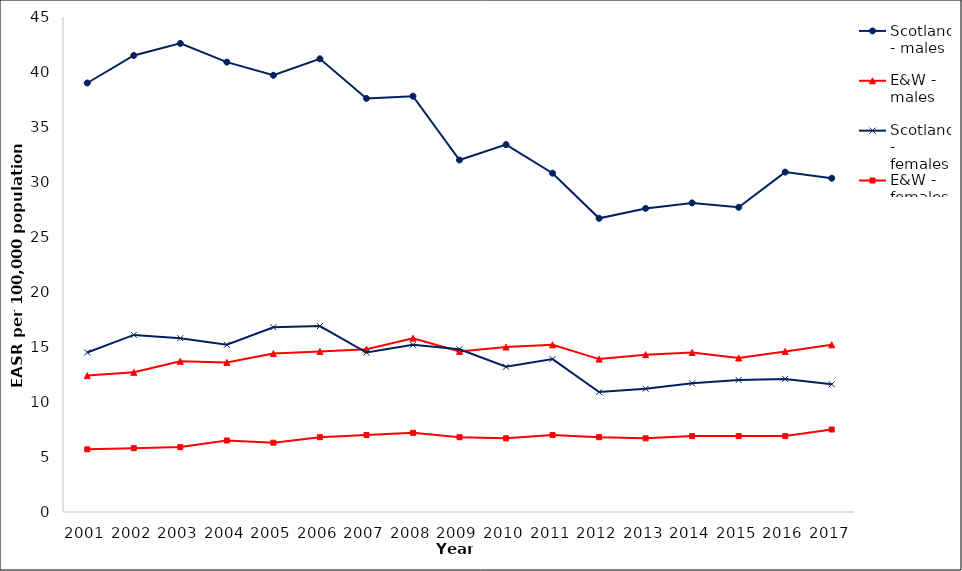
| Category | Scotland - males | E&W - males | Scotland - females | E&W - females |
|---|---|---|---|---|
| 2001.0 | 39 | 12.4 | 14.5 | 5.7 |
| 2002.0 | 41.5 | 12.7 | 16.1 | 5.8 |
| 2003.0 | 42.6 | 13.7 | 15.8 | 5.9 |
| 2004.0 | 40.9 | 13.6 | 15.2 | 6.5 |
| 2005.0 | 39.7 | 14.4 | 16.8 | 6.3 |
| 2006.0 | 41.2 | 14.6 | 16.9 | 6.8 |
| 2007.0 | 37.6 | 14.8 | 14.5 | 7 |
| 2008.0 | 37.8 | 15.8 | 15.2 | 7.2 |
| 2009.0 | 32 | 14.6 | 14.8 | 6.8 |
| 2010.0 | 33.4 | 15 | 13.2 | 6.7 |
| 2011.0 | 30.8 | 15.2 | 13.9 | 7 |
| 2012.0 | 26.7 | 13.9 | 10.9 | 6.8 |
| 2013.0 | 27.6 | 14.3 | 11.2 | 6.7 |
| 2014.0 | 28.1 | 14.5 | 11.7 | 6.9 |
| 2015.0 | 27.7 | 14 | 12 | 6.9 |
| 2016.0 | 30.9 | 14.6 | 12.1 | 6.9 |
| 2017.0 | 30.343 | 15.2 | 11.614 | 7.5 |